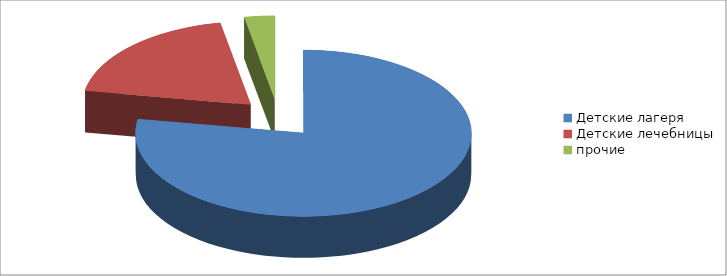
| Category | Series 0 |
|---|---|
| Детские лагеря | 8 |
| Детские лечебницы | 2 |
| прочие | 0.3 |